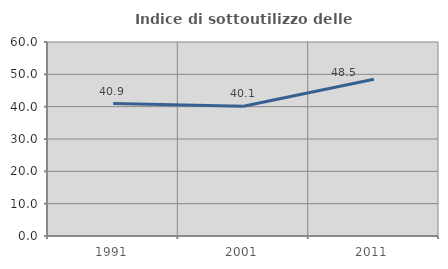
| Category | Indice di sottoutilizzo delle abitazioni  |
|---|---|
| 1991.0 | 40.945 |
| 2001.0 | 40.136 |
| 2011.0 | 48.466 |